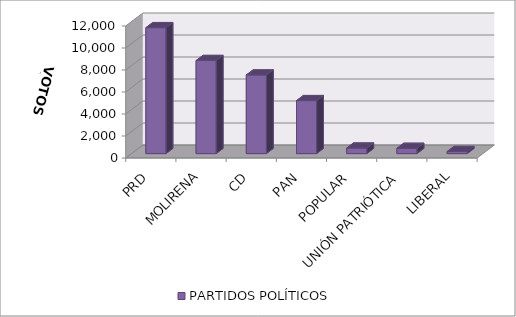
| Category | PARTIDOS POLÍTICOS |
|---|---|
| PRD | 11448 |
| MOLIRENA | 8462 |
| CD | 7144 |
| PAN | 4815 |
| POPULAR | 502 |
| UNIÓN PATRIÓTICA | 478 |
| LIBERAL | 188 |